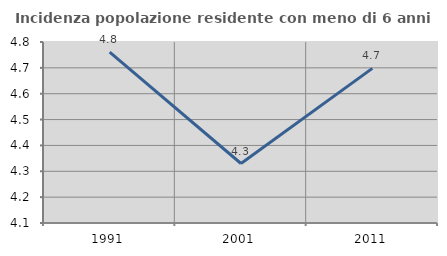
| Category | Incidenza popolazione residente con meno di 6 anni |
|---|---|
| 1991.0 | 4.761 |
| 2001.0 | 4.33 |
| 2011.0 | 4.698 |